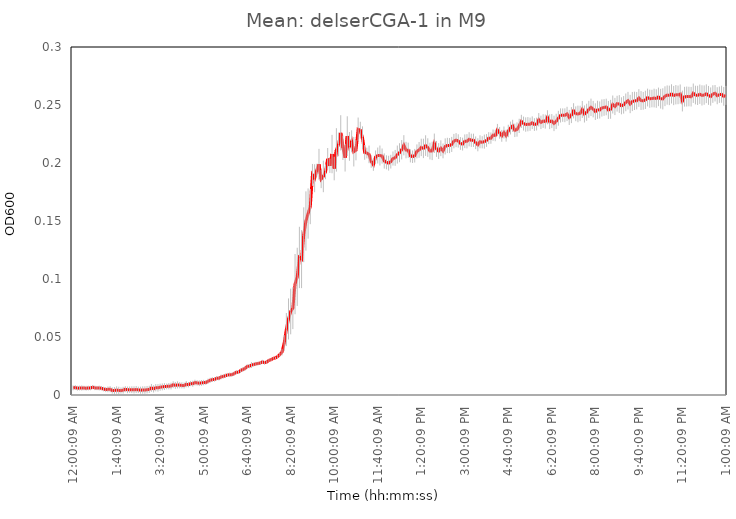
| Category | Ser_cga_del |
|---|---|
| 0.00010416666666666667 | 0.006 |
| 0.0035763888888888894 | 0.006 |
| 0.0070486111111111105 | 0.006 |
| 0.010520833333333333 | 0.006 |
| 0.013993055555555555 | 0.006 |
| 0.017465277777777777 | 0.006 |
| 0.020937499999999998 | 0.006 |
| 0.02440972222222222 | 0.006 |
| 0.027881944444444445 | 0.006 |
| 0.03135416666666666 | 0.007 |
| 0.034826388888888886 | 0.006 |
| 0.03829861111111111 | 0.006 |
| 0.04177083333333333 | 0.006 |
| 0.04524305555555556 | 0.006 |
| 0.04871527777777778 | 0.005 |
| 0.0521875 | 0.005 |
| 0.05565972222222223 | 0.005 |
| 0.059131944444444445 | 0.005 |
| 0.06260416666666667 | 0.004 |
| 0.06607638888888889 | 0.004 |
| 0.06954861111111112 | 0.004 |
| 0.07302083333333333 | 0.004 |
| 0.07649305555555556 | 0.004 |
| 0.07996527777777777 | 0.004 |
| 0.0834375 | 0.005 |
| 0.08690972222222222 | 0.004 |
| 0.09038194444444443 | 0.005 |
| 0.09385416666666667 | 0.005 |
| 0.09732638888888889 | 0.004 |
| 0.1007986111111111 | 0.005 |
| 0.10427083333333333 | 0.004 |
| 0.10774305555555556 | 0.004 |
| 0.11121527777777777 | 0.004 |
| 0.1146875 | 0.004 |
| 0.11815972222222222 | 0.005 |
| 0.12163194444444443 | 0.005 |
| 0.12510416666666666 | 0.006 |
| 0.1285763888888889 | 0.005 |
| 0.1320486111111111 | 0.006 |
| 0.13552083333333334 | 0.006 |
| 0.13899305555555555 | 0.007 |
| 0.14246527777777776 | 0.007 |
| 0.1459375 | 0.007 |
| 0.14940972222222224 | 0.007 |
| 0.15288194444444445 | 0.008 |
| 0.15635416666666666 | 0.008 |
| 0.1598263888888889 | 0.009 |
| 0.1632986111111111 | 0.008 |
| 0.16677083333333334 | 0.009 |
| 0.17024305555555555 | 0.008 |
| 0.17371527777777776 | 0.008 |
| 0.17718750000000003 | 0.008 |
| 0.18065972222222224 | 0.009 |
| 0.18413194444444445 | 0.009 |
| 0.18760416666666666 | 0.01 |
| 0.1910763888888889 | 0.01 |
| 0.1945486111111111 | 0.011 |
| 0.1980208333333333 | 0.01 |
| 0.20149305555555555 | 0.01 |
| 0.20496527777777776 | 0.01 |
| 0.20843750000000003 | 0.011 |
| 0.21190972222222224 | 0.011 |
| 0.21538194444444445 | 0.012 |
| 0.21885416666666668 | 0.013 |
| 0.2223263888888889 | 0.013 |
| 0.2257986111111111 | 0.013 |
| 0.2292708333333333 | 0.014 |
| 0.23274305555555555 | 0.014 |
| 0.23621527777777776 | 0.016 |
| 0.23968749999999997 | 0.016 |
| 0.24315972222222224 | 0.017 |
| 0.24663194444444445 | 0.017 |
| 0.2501041666666667 | 0.017 |
| 0.2535763888888889 | 0.018 |
| 0.2570486111111111 | 0.018 |
| 0.26052083333333337 | 0.02 |
| 0.2639930555555556 | 0.02 |
| 0.2674652777777778 | 0.021 |
| 0.27092592592592596 | 0.022 |
| 0.2744097222222222 | 0.023 |
| 0.2778819444444444 | 0.025 |
| 0.2813541666666666 | 0.025 |
| 0.2848263888888889 | 0.026 |
| 0.2882986111111111 | 0.026 |
| 0.29177083333333337 | 0.027 |
| 0.2952430555555556 | 0.027 |
| 0.2987152777777778 | 0.028 |
| 0.3021875 | 0.029 |
| 0.3056597222222222 | 0.028 |
| 0.3091319444444444 | 0.028 |
| 0.3126041666666666 | 0.03 |
| 0.3160763888888889 | 0.03 |
| 0.3195486111111111 | 0.032 |
| 0.3230208333333333 | 0.032 |
| 0.3264930555555556 | 0.033 |
| 0.3299652777777778 | 0.035 |
| 0.3334375 | 0.037 |
| 0.3369097222222222 | 0.045 |
| 0.3403819444444445 | 0.056 |
| 0.3438541666666666 | 0.066 |
| 0.3473263888888889 | 0.072 |
| 0.35079861111111116 | 0.075 |
| 0.3542708333333333 | 0.096 |
| 0.3577430555555556 | 0.102 |
| 0.3612152777777778 | 0.119 |
| 0.3646875 | 0.117 |
| 0.3681597222222222 | 0.138 |
| 0.3716319444444445 | 0.15 |
| 0.3751041666666666 | 0.156 |
| 0.3785763888888889 | 0.162 |
| 0.38204861111111116 | 0.19 |
| 0.3855208333333333 | 0.187 |
| 0.3889930555555556 | 0.194 |
| 0.3924652777777778 | 0.199 |
| 0.3959375 | 0.186 |
| 0.3994097222222222 | 0.188 |
| 0.4028819444444445 | 0.192 |
| 0.4063541666666666 | 0.204 |
| 0.4098263888888889 | 0.198 |
| 0.41329861111111116 | 0.208 |
| 0.4167708333333333 | 0.195 |
| 0.4202430555555556 | 0.211 |
| 0.4237152777777778 | 0.216 |
| 0.4271875 | 0.226 |
| 0.4306597222222222 | 0.213 |
| 0.4341319444444445 | 0.205 |
| 0.4376041666666666 | 0.223 |
| 0.4410763888888889 | 0.214 |
| 0.44454861111111116 | 0.219 |
| 0.4480208333333333 | 0.21 |
| 0.4514930555555556 | 0.211 |
| 0.4549652777777778 | 0.229 |
| 0.4584375 | 0.228 |
| 0.4619097222222222 | 0.222 |
| 0.4653819444444445 | 0.209 |
| 0.4688541666666666 | 0.209 |
| 0.4723263888888889 | 0.207 |
| 0.47579861111111116 | 0.201 |
| 0.4792708333333333 | 0.198 |
| 0.4827430555555556 | 0.205 |
| 0.4862152777777778 | 0.206 |
| 0.4896875 | 0.206 |
| 0.4931597222222222 | 0.206 |
| 0.4966319444444445 | 0.202 |
| 0.5001041666666667 | 0.201 |
| 0.5035763888888889 | 0.2 |
| 0.5070486111111111 | 0.201 |
| 0.5105208333333333 | 0.204 |
| 0.5139930555555555 | 0.204 |
| 0.5174652777777778 | 0.207 |
| 0.5209374999999999 | 0.209 |
| 0.5244097222222223 | 0.211 |
| 0.5278819444444445 | 0.215 |
| 0.5313541666666667 | 0.211 |
| 0.5348263888888889 | 0.211 |
| 0.5382986111111111 | 0.206 |
| 0.5417708333333333 | 0.205 |
| 0.5452430555555555 | 0.206 |
| 0.5487152777777778 | 0.21 |
| 0.5521874999999999 | 0.211 |
| 0.5556597222222223 | 0.213 |
| 0.5591319444444445 | 0.213 |
| 0.5626041666666667 | 0.215 |
| 0.5660763888888889 | 0.213 |
| 0.5695486111111111 | 0.21 |
| 0.5730208333333333 | 0.21 |
| 0.5764930555555555 | 0.217 |
| 0.5799652777777778 | 0.212 |
| 0.5834374999999999 | 0.21 |
| 0.5869097222222223 | 0.213 |
| 0.5903819444444445 | 0.21 |
| 0.5938541666666667 | 0.214 |
| 0.5973263888888889 | 0.215 |
| 0.6007986111111111 | 0.215 |
| 0.6042708333333333 | 0.216 |
| 0.6077430555555555 | 0.219 |
| 0.6112152777777778 | 0.22 |
| 0.6146874999999999 | 0.219 |
| 0.6181597222222223 | 0.217 |
| 0.6216319444444445 | 0.216 |
| 0.6251041666666667 | 0.219 |
| 0.6285763888888889 | 0.219 |
| 0.6320486111111111 | 0.22 |
| 0.6355208333333333 | 0.22 |
| 0.6389930555555555 | 0.22 |
| 0.6424652777777778 | 0.217 |
| 0.6459374999999999 | 0.216 |
| 0.6494097222222223 | 0.218 |
| 0.6528819444444445 | 0.218 |
| 0.6563541666666667 | 0.218 |
| 0.6598263888888889 | 0.219 |
| 0.6632986111111111 | 0.221 |
| 0.6667708333333334 | 0.221 |
| 0.6702430555555555 | 0.224 |
| 0.6737152777777777 | 0.224 |
| 0.6771875 | 0.228 |
| 0.6806597222222223 | 0.226 |
| 0.6841319444444444 | 0.223 |
| 0.6876041666666667 | 0.226 |
| 0.6910763888888889 | 0.224 |
| 0.6945486111111111 | 0.228 |
| 0.6980208333333334 | 0.23 |
| 0.7014930555555555 | 0.232 |
| 0.7049652777777777 | 0.228 |
| 0.7084375 | 0.229 |
| 0.7119097222222223 | 0.232 |
| 0.7153819444444444 | 0.236 |
| 0.7188541666666667 | 0.234 |
| 0.7223263888888889 | 0.233 |
| 0.7257986111111111 | 0.233 |
| 0.7292708333333334 | 0.233 |
| 0.7327430555555555 | 0.235 |
| 0.7362152777777777 | 0.233 |
| 0.7396875 | 0.234 |
| 0.7431597222222223 | 0.237 |
| 0.7466319444444444 | 0.235 |
| 0.7501041666666667 | 0.236 |
| 0.7535763888888889 | 0.236 |
| 0.7570486111111111 | 0.239 |
| 0.7605208333333334 | 0.236 |
| 0.7639930555555555 | 0.236 |
| 0.7674652777777777 | 0.234 |
| 0.7709375 | 0.236 |
| 0.7744097222222223 | 0.239 |
| 0.7778819444444444 | 0.241 |
| 0.7813541666666667 | 0.241 |
| 0.7848263888888889 | 0.241 |
| 0.7882986111111111 | 0.242 |
| 0.7917708333333334 | 0.239 |
| 0.7952430555555555 | 0.241 |
| 0.7987152777777777 | 0.245 |
| 0.8021875 | 0.242 |
| 0.8056597222222223 | 0.242 |
| 0.8091319444444444 | 0.243 |
| 0.8126041666666667 | 0.246 |
| 0.8160763888888889 | 0.242 |
| 0.8195486111111111 | 0.244 |
| 0.8230208333333334 | 0.246 |
| 0.8264930555555555 | 0.248 |
| 0.8299652777777777 | 0.246 |
| 0.8334375 | 0.244 |
| 0.8369097222222223 | 0.246 |
| 0.8403819444444444 | 0.246 |
| 0.8438541666666667 | 0.247 |
| 0.8473263888888889 | 0.248 |
| 0.8507986111111111 | 0.248 |
| 0.8542708333333334 | 0.246 |
| 0.8577430555555555 | 0.246 |
| 0.8612152777777777 | 0.25 |
| 0.8646875 | 0.249 |
| 0.8681597222222223 | 0.251 |
| 0.8716319444444444 | 0.251 |
| 0.8751041666666667 | 0.249 |
| 0.8785763888888889 | 0.25 |
| 0.8820486111111111 | 0.252 |
| 0.8855208333333334 | 0.254 |
| 0.8889930555555555 | 0.251 |
| 0.8924652777777777 | 0.253 |
| 0.8959375 | 0.254 |
| 0.8994097222222223 | 0.254 |
| 0.9028819444444444 | 0.256 |
| 0.9063541666666667 | 0.254 |
| 0.9098263888888889 | 0.254 |
| 0.9132986111111111 | 0.254 |
| 0.9167708333333334 | 0.256 |
| 0.9202430555555555 | 0.255 |
| 0.9237152777777777 | 0.256 |
| 0.9271875 | 0.256 |
| 0.9306597222222223 | 0.256 |
| 0.9341319444444444 | 0.257 |
| 0.9376041666666667 | 0.255 |
| 0.9410763888888889 | 0.255 |
| 0.9445486111111111 | 0.258 |
| 0.9480208333333334 | 0.259 |
| 0.9514930555555555 | 0.258 |
| 0.9549652777777777 | 0.26 |
| 0.9584375 | 0.258 |
| 0.9619097222222223 | 0.259 |
| 0.9653819444444444 | 0.259 |
| 0.9688541666666667 | 0.259 |
| 0.9723263888888889 | 0.253 |
| 0.9757986111111111 | 0.257 |
| 0.9792708333333334 | 0.257 |
| 0.9827430555555555 | 0.257 |
| 0.9862152777777777 | 0.257 |
| 0.9896875 | 0.26 |
| 0.9931597222222223 | 0.259 |
| 0.9966319444444444 | 0.258 |
| 1900-01-01 00:00:09 | 0.259 |
| 1900-01-01 00:05:09 | 0.258 |
| 1900-01-01 00:10:09 | 0.259 |
| 1900-01-01 00:15:09 | 0.26 |
| 1900-01-01 00:20:09 | 0.258 |
| 1900-01-01 00:25:09 | 0.257 |
| 1900-01-01 00:30:09 | 0.259 |
| 1900-01-01 00:35:09 | 0.26 |
| 1900-01-01 00:40:09 | 0.258 |
| 1900-01-01 00:45:09 | 0.259 |
| 1900-01-01 00:50:09 | 0.259 |
| 1900-01-01 00:55:09 | 0.257 |
| 1900-01-01 01:00:09 | 0.258 |